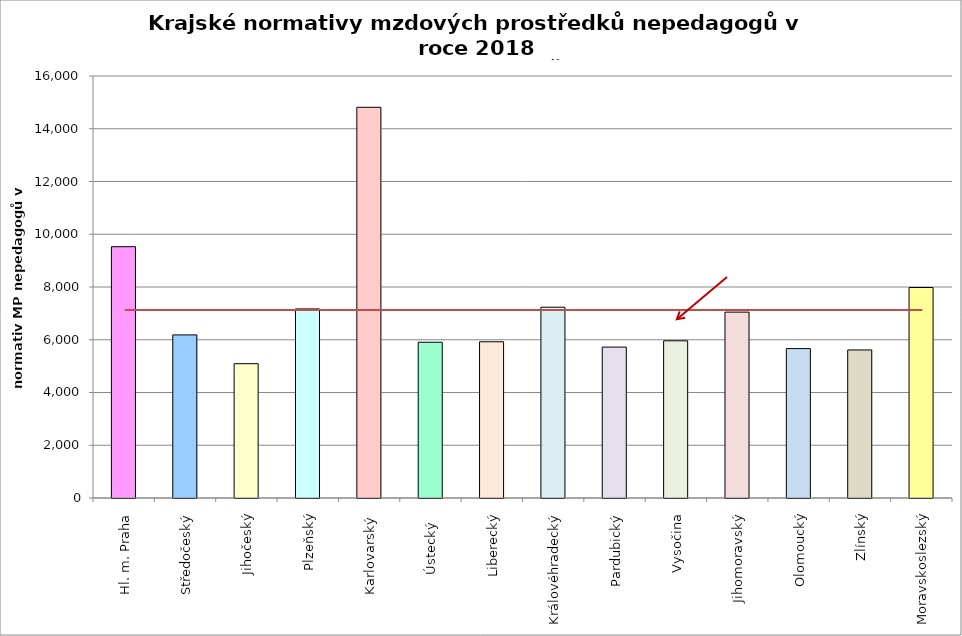
| Category | Series 0 |
|---|---|
| Hl. m. Praha | 9528 |
| Středočeský | 6183.902 |
| Jihočeský | 5092.318 |
| Plzeňský | 7168.875 |
| Karlovarský  | 14813.793 |
| Ústecký   | 5905.243 |
| Liberecký | 5923.061 |
| Královéhradecký | 7234.58 |
| Pardubický | 5721.681 |
| Vysočina | 5960.301 |
| Jihomoravský | 7047.818 |
| Olomoucký | 5665.037 |
| Zlínský | 5613.642 |
| Moravskoslezský | 7980.648 |